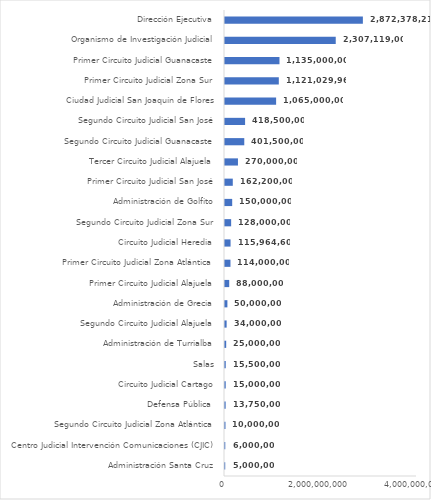
| Category | Series 0 |
|---|---|
| Administración Santa Cruz | 5000000 |
| Centro Judicial Intervención Comunicaciones (CJIC) | 6000000 |
| Segundo Circuito Judicial Zona Atlántica | 10000000 |
| Defensa Pública  | 13750000 |
| Circuito Judicial Cartago | 15000000 |
| Salas | 15500000 |
| Administración de Turrialba | 25000000 |
| Segundo Circuito Judicial Alajuela | 34000000 |
| Administración de Grecia | 50000000 |
| Primer Circuito Judicial Alajuela | 88000000 |
| Primer Circuito Judicial Zona Atlántica | 114000000 |
| Circuito Judicial Heredia | 115964600 |
| Segundo Circuito Judicial Zona Sur | 128000000 |
| Administración de Golfito | 150000000 |
| Primer Circuito Judicial San José | 162200000 |
| Tercer Circuito Judicial Alajuela | 270000000 |
| Segundo Circuito Judicial Guanacaste | 401500000 |
| Segundo Circuito Judicial San José | 418500000 |
| Ciudad Judicial San Joaquín de Flores | 1065000000 |
| Primer Circuito Judicial Zona Sur | 1121029969.39 |
| Primer Circuito Judicial Guanacaste | 1135000000 |
| Organismo de Investigación Judicial | 2307119000 |
| Dirección Ejecutiva | 2872378210.61 |